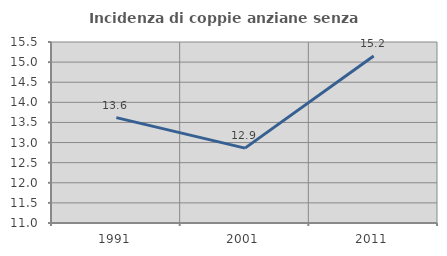
| Category | Incidenza di coppie anziane senza figli  |
|---|---|
| 1991.0 | 13.62 |
| 2001.0 | 12.862 |
| 2011.0 | 15.152 |